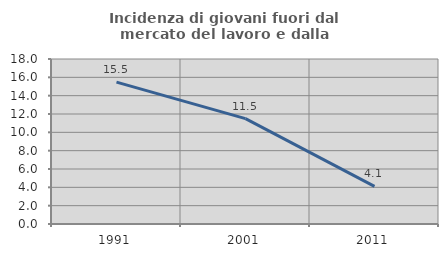
| Category | Incidenza di giovani fuori dal mercato del lavoro e dalla formazione  |
|---|---|
| 1991.0 | 15.476 |
| 2001.0 | 11.494 |
| 2011.0 | 4.11 |